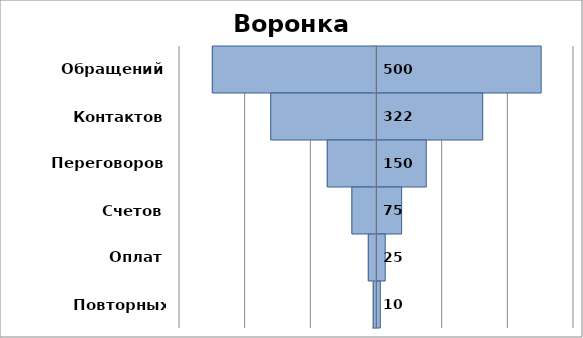
| Category | Series 0 | Series 1 |
|---|---|---|
| Обращений | -500 | 500 |
| Контактов | -322 | 322 |
| Переговоров | -150 | 150 |
| Счетов | -75 | 75 |
| Оплат | -25 | 25 |
| Повторных заказов | -10 | 10 |